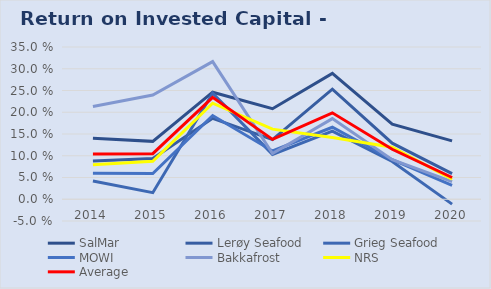
| Category | SalMar | Lerøy Seafood | Grieg Seafood | MOWI | Bakkafrost | NRS | Average |
|---|---|---|---|---|---|---|---|
| 2014.0 | 0.14 | 0.088 | 0.042 | 0.06 | 0.213 | 0.079 | 0.104 |
| 2015.0 | 0.133 | 0.094 | 0.015 | 0.059 | 0.24 | 0.087 | 0.105 |
| 2016.0 | 0.246 | 0.186 | 0.244 | 0.192 | 0.316 | 0.221 | 0.234 |
| 2017.0 | 0.208 | 0.137 | 0.103 | 0.111 | 0.105 | 0.161 | 0.138 |
| 2018.0 | 0.289 | 0.253 | 0.157 | 0.166 | 0.185 | 0.142 | 0.199 |
| 2019.0 | 0.172 | 0.129 | 0.087 | 0.091 | 0.091 | 0.12 | 0.115 |
| 2020.0 | 0.134 | 0.059 | -0.011 | 0.032 | 0.04 | 0.046 | 0.05 |